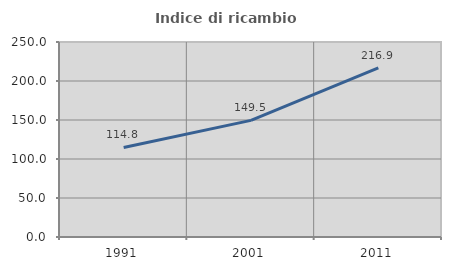
| Category | Indice di ricambio occupazionale  |
|---|---|
| 1991.0 | 114.791 |
| 2001.0 | 149.498 |
| 2011.0 | 216.887 |